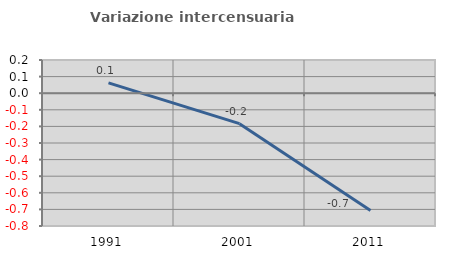
| Category | Variazione intercensuaria annua |
|---|---|
| 1991.0 | 0.063 |
| 2001.0 | -0.184 |
| 2011.0 | -0.707 |